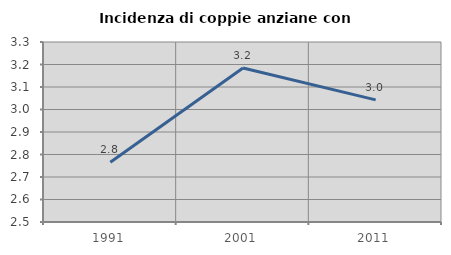
| Category | Incidenza di coppie anziane con figli |
|---|---|
| 1991.0 | 2.766 |
| 2001.0 | 3.185 |
| 2011.0 | 3.043 |